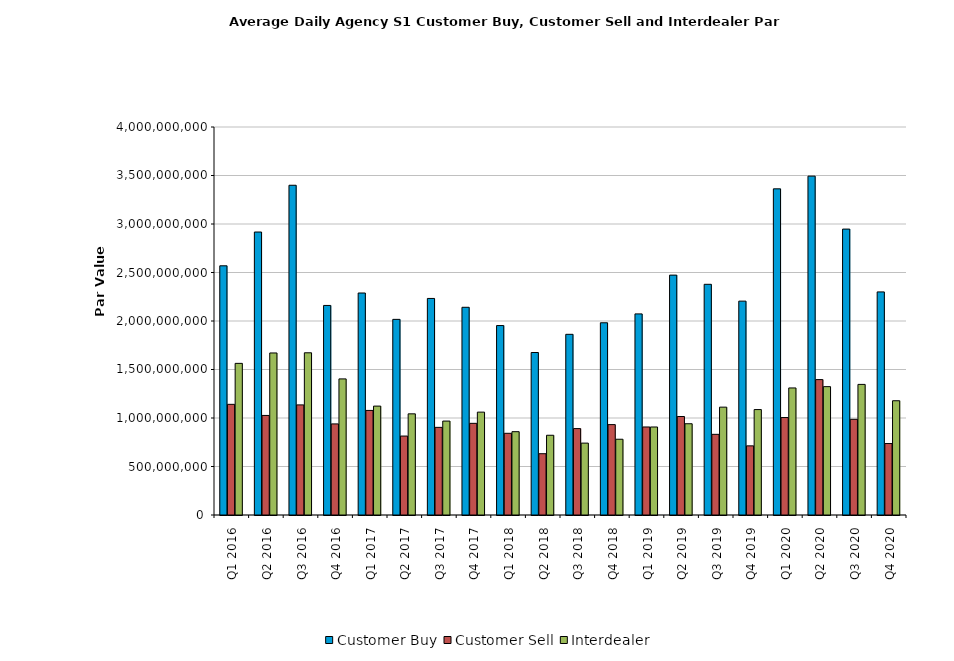
| Category | Customer Buy | Customer Sell | Interdealer |
|---|---|---|---|
| Q1 2016 | 2568983491.342 | 1140791292.575 | 1563195402.666 |
| Q2 2016 | 2917274475.03 | 1026356965.009 | 1670545845.46 |
| Q3 2016 | 3399325753.161 | 1135281635.486 | 1672242018.388 |
| Q4 2016 | 2160327281.462 | 939002830.424 | 1403044499.216 |
| Q1 2017 | 2288549096.546 | 1078026778.301 | 1122683290.019 |
| Q2 2017 | 2016854071.308 | 813934660.294 | 1043002274.748 |
| Q3 2017 | 2232465339.305 | 903380763.894 | 968337710.99 |
| Q4 2017 | 2141415256.413 | 944944928.291 | 1060535846.087 |
| Q1 2018 | 1953070289.161 | 842225728.237 | 858924653.267 |
| Q2 2018 | 1675130757.897 | 631829280.343 | 822052220.44 |
| Q3 2018 | 1862749665.292 | 890746088.764 | 740998328.027 |
| Q4 2018 | 1981793898.347 | 931891609.234 | 780997176.341 |
| Q1 2019 | 2073261289.88 | 907510641.636 | 907260794.476 |
| Q2 2019 | 2473016544.594 | 1015360883.633 | 940855570.046 |
| Q3 2019 | 2378240723.661 | 831622963.177 | 1111864355.118 |
| Q4 2019 | 2204844278.563 | 712918478.978 | 1086841151.009 |
| Q1 2020 | 3362551755.186 | 1004751117.532 | 1309827535.649 |
| Q2 2020 | 3493551277.386 | 1395918416.507 | 1323386792.52 |
| Q3 2020 | 2947577049.279 | 986470577.23 | 1346329562.976 |
| Q4 2020 | 2299861782.395 | 736719021.503 | 1177913333.868 |